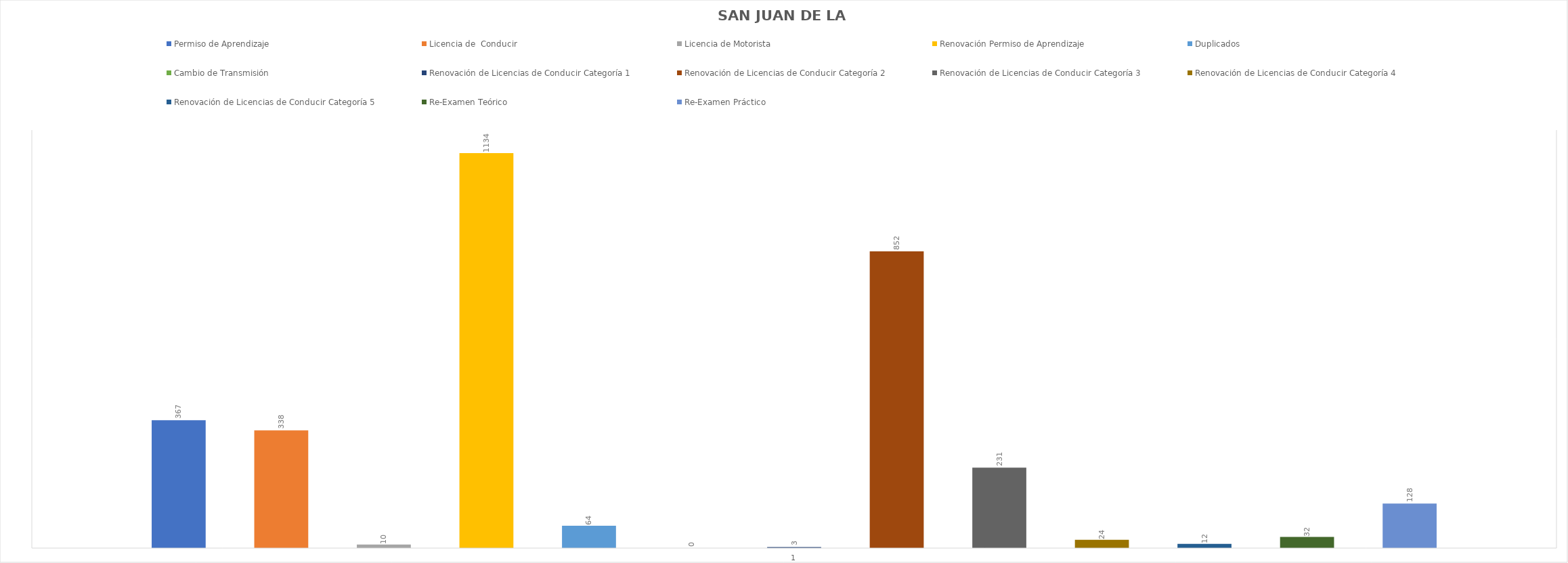
| Category | Permiso de Aprendizaje  | Licencia de  Conducir  | Licencia de Motorista | Renovación Permiso de Aprendizaje | Duplicados  | Cambio de Transmisión  | Renovación de Licencias de Conducir Categoría 1 | Renovación de Licencias de Conducir Categoría 2 | Renovación de Licencias de Conducir Categoría 3 | Renovación de Licencias de Conducir Categoría 4 | Renovación de Licencias de Conducir Categoría 5 | Re-Examen Teórico | Re-Examen Práctico |
|---|---|---|---|---|---|---|---|---|---|---|---|---|---|
| 0 | 367 | 338 | 10 | 1134 | 64 | 0 | 3 | 852 | 231 | 24 | 12 | 32 | 128 |